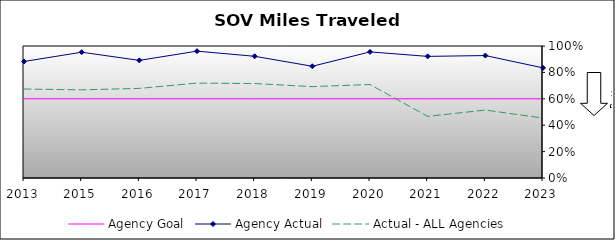
| Category | Agency Goal | Agency Actual | Actual - ALL Agencies |
|---|---|---|---|
| 2013.0 | 0.6 | 0.883 | 0.674 |
| 2015.0 | 0.6 | 0.953 | 0.668 |
| 2016.0 | 0.6 | 0.891 | 0.679 |
| 2017.0 | 0.6 | 0.961 | 0.719 |
| 2018.0 | 0.6 | 0.922 | 0.715 |
| 2019.0 | 0.6 | 0.846 | 0.692 |
| 2020.0 | 0.6 | 0.955 | 0.708 |
| 2021.0 | 0.6 | 0.921 | 0.467 |
| 2022.0 | 0.6 | 0.928 | 0.515 |
| 2023.0 | 0.6 | 0.834 | 0.454 |